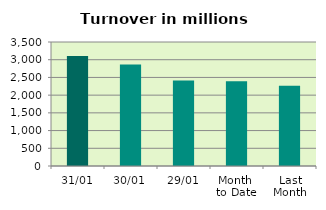
| Category | Series 0 |
|---|---|
| 31/01 | 3107.708 |
| 30/01 | 2867.288 |
| 29/01 | 2413.685 |
| Month 
to Date | 2394.171 |
| Last
Month | 2262.611 |